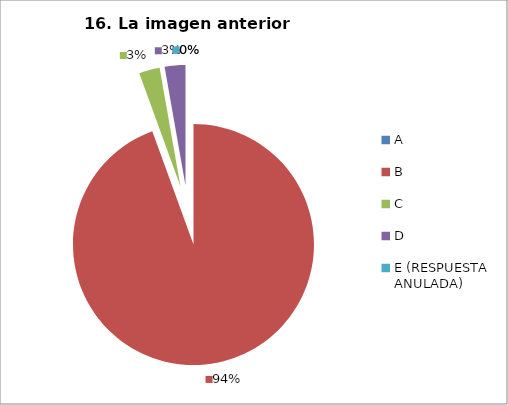
| Category | CANTIDAD DE RESPUESTAS PREGUNTA (16) | PORCENTAJE |
|---|---|---|
| A | 0 | 0 |
| B | 34 | 0.944 |
| C | 1 | 0.028 |
| D | 1 | 0.028 |
| E (RESPUESTA ANULADA) | 0 | 0 |